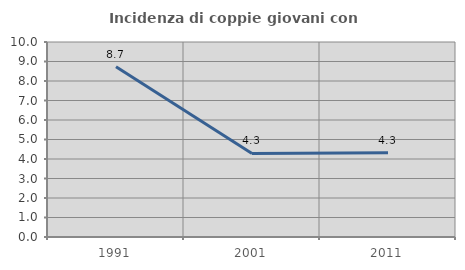
| Category | Incidenza di coppie giovani con figli |
|---|---|
| 1991.0 | 8.727 |
| 2001.0 | 4.286 |
| 2011.0 | 4.324 |